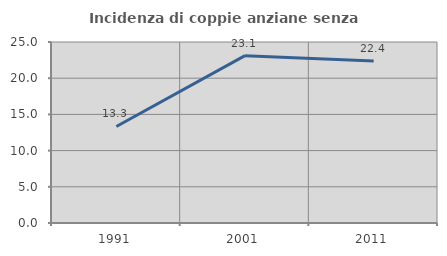
| Category | Incidenza di coppie anziane senza figli  |
|---|---|
| 1991.0 | 13.333 |
| 2001.0 | 23.116 |
| 2011.0 | 22.36 |